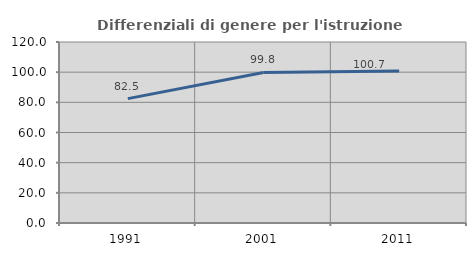
| Category | Differenziali di genere per l'istruzione superiore |
|---|---|
| 1991.0 | 82.458 |
| 2001.0 | 99.839 |
| 2011.0 | 100.737 |